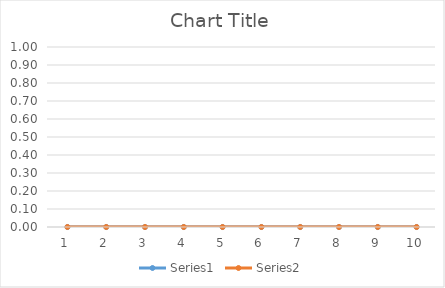
| Category | Series 0 | Series 1 |
|---|---|---|
| 0 | 0 | 0 |
| 1 | 0 | 0 |
| 2 | 0 | 0 |
| 3 | 0 | 0 |
| 4 | 0 | 0 |
| 5 | 0 | 0 |
| 6 | 0 | 0 |
| 7 | 0 | 0 |
| 8 | 0 | 0 |
| 9 | 0 | 0 |